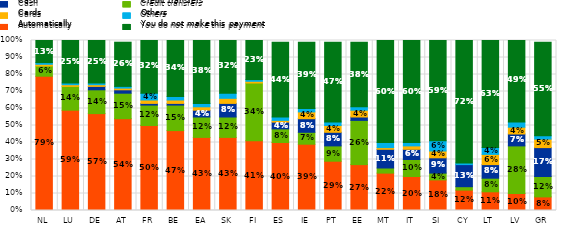
| Category | Automatically  | Credit transfers  | Cash | Cards | Others | You do not make this payment  |
|---|---|---|---|---|---|---|
| NL | 0.79 | 0.06 | 0 | 0.01 | 0.01 | 0.13 |
| LU | 0.59 | 0.14 | 0 | 0.01 | 0.01 | 0.25 |
| DE | 0.57 | 0.14 | 0.02 | 0.01 | 0.01 | 0.25 |
| AT | 0.54 | 0.15 | 0.02 | 0.01 | 0.01 | 0.26 |
| FR | 0.5 | 0.12 | 0.01 | 0.02 | 0.04 | 0.32 |
| BE | 0.47 | 0.15 | 0.01 | 0.02 | 0.02 | 0.34 |
| EA | 0.43 | 0.12 | 0.04 | 0.02 | 0.02 | 0.38 |
| SK | 0.43 | 0.12 | 0.08 | 0.03 | 0.03 | 0.32 |
| FI | 0.41 | 0.34 | 0 | 0.01 | 0.01 | 0.23 |
| ES | 0.4 | 0.08 | 0.04 | 0.01 | 0.02 | 0.44 |
| IE | 0.39 | 0.07 | 0.08 | 0.04 | 0.02 | 0.39 |
| PT | 0.29 | 0.09 | 0.08 | 0.04 | 0.02 | 0.47 |
| EE | 0.27 | 0.26 | 0.02 | 0.04 | 0.02 | 0.38 |
| MT | 0.22 | 0.03 | 0.11 | 0.01 | 0.03 | 0.6 |
| IT | 0.2 | 0.1 | 0.06 | 0.02 | 0.02 | 0.6 |
| SI | 0.18 | 0.04 | 0.09 | 0.04 | 0.06 | 0.59 |
| CY | 0.12 | 0.02 | 0.13 | 0 | 0.01 | 0.72 |
| LT | 0.11 | 0.08 | 0.08 | 0.06 | 0.04 | 0.63 |
| LV | 0.1 | 0.28 | 0.07 | 0.04 | 0.03 | 0.49 |
| GR | 0.08 | 0.12 | 0.17 | 0.05 | 0.02 | 0.55 |